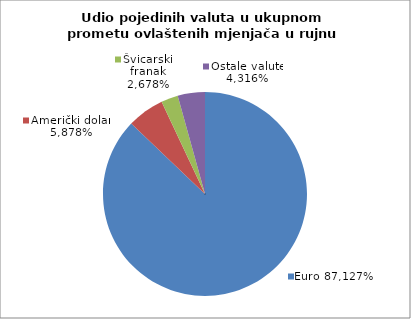
| Category | EUR |
|---|---|
| 0 | 0.871 |
| 1 | 0.059 |
| 2 | 0.027 |
| 3 | 0.043 |